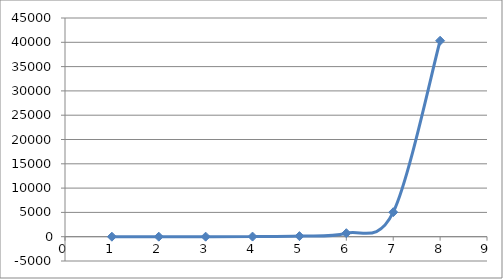
| Category | Series 0 |
|---|---|
| 1.0 | 1 |
| 2.0 | 2 |
| 3.0 | 6 |
| 4.0 | 24 |
| 5.0 | 120 |
| 6.0 | 720 |
| 7.0 | 5040 |
| 8.0 | 40320 |